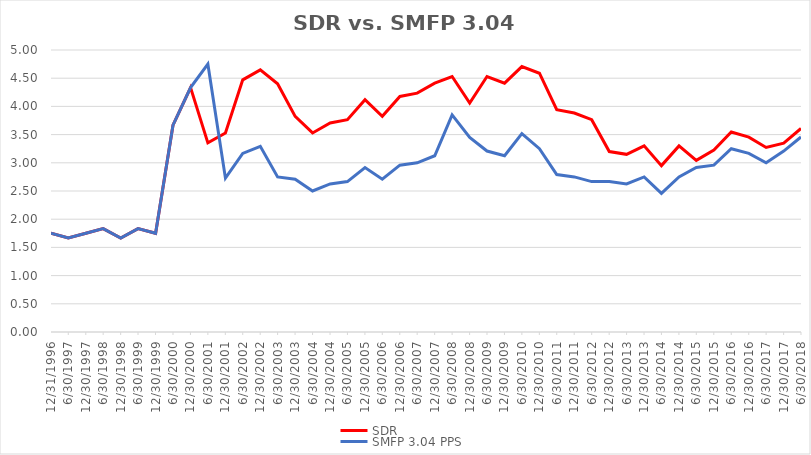
| Category | SDR | SMFP 3.04 PPS |
|---|---|---|
| 12/31/96 | 1.75 | 1.75 |
| 6/30/97 | 1.667 | 1.667 |
| 12/31/97 | 1.75 | 1.75 |
| 6/30/98 | 1.833 | 1.833 |
| 12/31/98 | 1.667 | 1.667 |
| 6/30/99 | 1.833 | 1.833 |
| 12/31/99 | 1.75 | 1.75 |
| 6/30/00 | 3.667 | 3.667 |
| 12/31/00 | 4.333 | 4.333 |
| 6/30/01 | 3.353 | 4.75 |
| 12/31/01 | 3.529 | 2.727 |
| 6/30/02 | 4.471 | 3.167 |
| 12/31/02 | 4.647 | 3.292 |
| 6/30/03 | 4.4 | 2.75 |
| 12/31/03 | 3.824 | 2.708 |
| 6/30/04 | 3.529 | 2.5 |
| 12/31/04 | 3.706 | 2.625 |
| 6/30/05 | 3.765 | 2.667 |
| 12/31/05 | 4.118 | 2.917 |
| 6/30/06 | 3.824 | 2.708 |
| 12/31/06 | 4.176 | 2.958 |
| 6/30/07 | 4.235 | 3 |
| 12/31/07 | 4.412 | 3.125 |
| 6/30/08 | 4.529 | 3.85 |
| 12/31/08 | 4.059 | 3.45 |
| 6/30/09 | 4.529 | 3.208 |
| 12/31/09 | 4.412 | 3.125 |
| 6/30/10 | 4.706 | 3.516 |
| 12/31/10 | 4.588 | 3.25 |
| 6/30/11 | 3.941 | 2.792 |
| 12/31/11 | 3.882 | 2.75 |
| 6/30/12 | 3.765 | 2.667 |
| 12/31/12 | 3.2 | 2.667 |
| 6/30/13 | 3.15 | 2.625 |
| 12/31/13 | 3.3 | 2.75 |
| 6/30/14 | 2.95 | 2.458 |
| 12/31/14 | 3.3 | 2.75 |
| 6/30/15 | 3.043 | 2.917 |
| 12/31/15 | 3.227 | 2.958 |
| 6/30/16 | 3.545 | 3.25 |
| 12/31/16 | 3.455 | 3.167 |
| 6/30/17 | 3.273 | 3 |
| 12/31/17 | 3.348 | 3.208 |
| 6/30/18 | 3.609 | 3.458 |